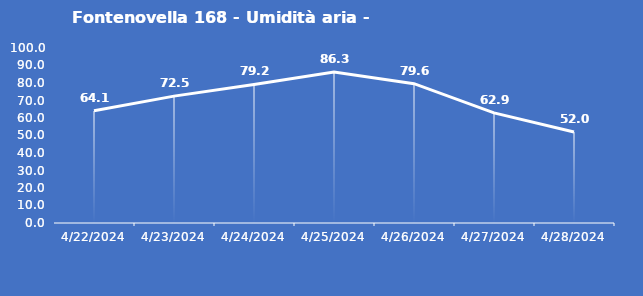
| Category | Fontenovella 168 - Umidità aria - Grezzo (%) |
|---|---|
| 4/22/24 | 64.1 |
| 4/23/24 | 72.5 |
| 4/24/24 | 79.2 |
| 4/25/24 | 86.3 |
| 4/26/24 | 79.6 |
| 4/27/24 | 62.9 |
| 4/28/24 | 52 |